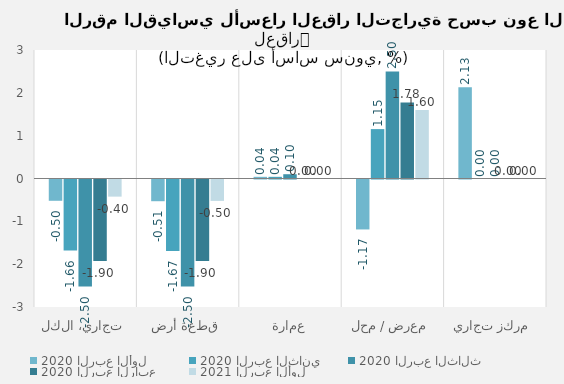
| Category | 2020 | 2021 |
|---|---|---|
| تجاري، الكل | -1.9 | -0.4 |
| قطعة أرض | -1.9 | -0.5 |
| عمارة | 0 | 0 |
| معرض / محل | 1.777 | 1.6 |
| مركز تجاري | 0 | 0 |